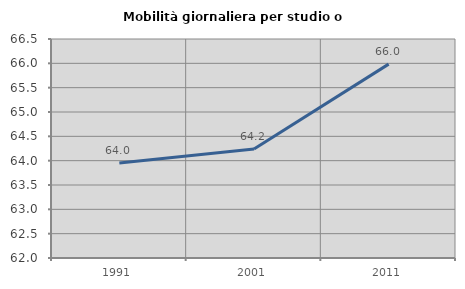
| Category | Mobilità giornaliera per studio o lavoro |
|---|---|
| 1991.0 | 63.953 |
| 2001.0 | 64.238 |
| 2011.0 | 65.984 |